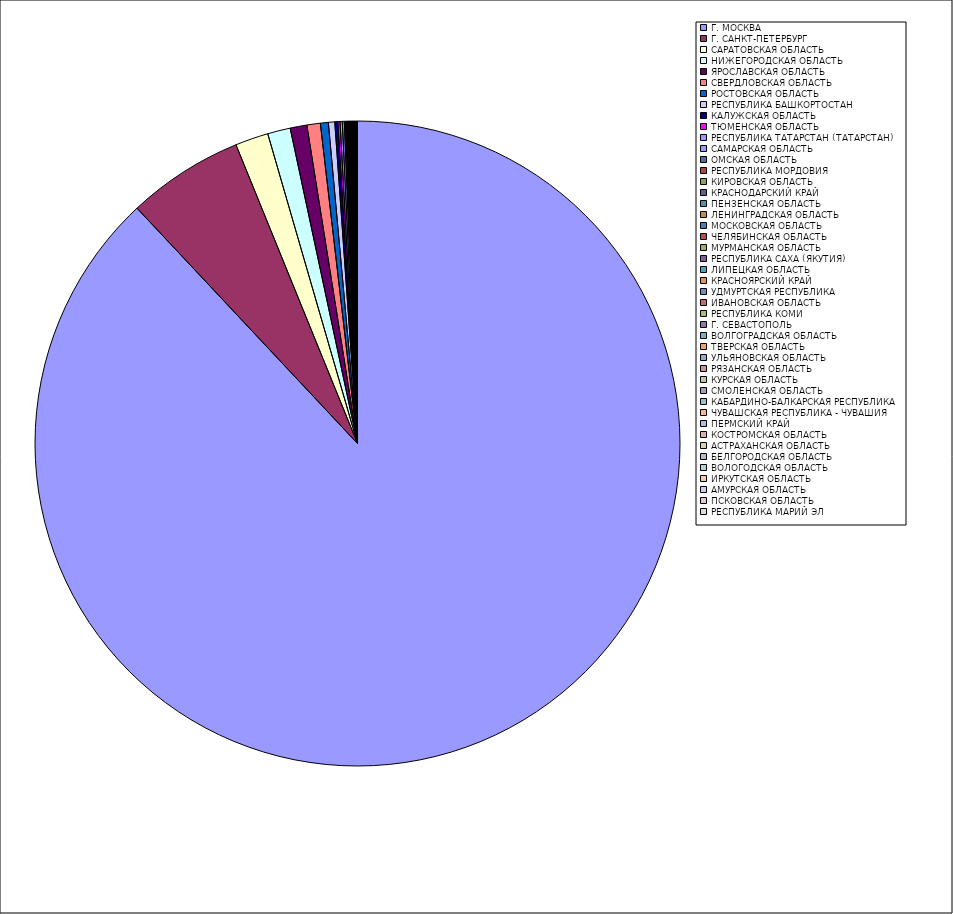
| Category | Оборот |
|---|---|
| Г. МОСКВА | 87.993 |
| Г. САНКТ-ПЕТЕРБУРГ | 5.833 |
| САРАТОВСКАЯ ОБЛАСТЬ | 1.66 |
| НИЖЕГОРОДСКАЯ ОБЛАСТЬ | 1.14 |
| ЯРОСЛАВСКАЯ ОБЛАСТЬ | 0.838 |
| СВЕРДЛОВСКАЯ ОБЛАСТЬ | 0.672 |
| РОСТОВСКАЯ ОБЛАСТЬ | 0.396 |
| РЕСПУБЛИКА БАШКОРТОСТАН | 0.32 |
| КАЛУЖСКАЯ ОБЛАСТЬ | 0.148 |
| ТЮМЕНСКАЯ ОБЛАСТЬ | 0.112 |
| РЕСПУБЛИКА ТАТАРСТАН (ТАТАРСТАН) | 0.111 |
| САМАРСКАЯ ОБЛАСТЬ | 0.098 |
| ОМСКАЯ ОБЛАСТЬ | 0.061 |
| РЕСПУБЛИКА МОРДОВИЯ | 0.044 |
| КИРОВСКАЯ ОБЛАСТЬ | 0.042 |
| КРАСНОДАРСКИЙ КРАЙ | 0.04 |
| ПЕНЗЕНСКАЯ ОБЛАСТЬ | 0.035 |
| ЛЕНИНГРАДСКАЯ ОБЛАСТЬ | 0.034 |
| МОСКОВСКАЯ ОБЛАСТЬ | 0.031 |
| ЧЕЛЯБИНСКАЯ ОБЛАСТЬ | 0.03 |
| МУРМАНСКАЯ ОБЛАСТЬ | 0.027 |
| РЕСПУБЛИКА САХА (ЯКУТИЯ) | 0.026 |
| ЛИПЕЦКАЯ ОБЛАСТЬ | 0.026 |
| КРАСНОЯРСКИЙ КРАЙ | 0.021 |
| УДМУРТСКАЯ РЕСПУБЛИКА | 0.018 |
| ИВАНОВСКАЯ ОБЛАСТЬ | 0.018 |
| РЕСПУБЛИКА КОМИ | 0.017 |
| Г. СЕВАСТОПОЛЬ | 0.016 |
| ВОЛГОГРАДСКАЯ ОБЛАСТЬ | 0.016 |
| ТВЕРСКАЯ ОБЛАСТЬ | 0.016 |
| УЛЬЯНОВСКАЯ ОБЛАСТЬ | 0.014 |
| РЯЗАНСКАЯ ОБЛАСТЬ | 0.013 |
| КУРСКАЯ ОБЛАСТЬ | 0.012 |
| СМОЛЕНСКАЯ ОБЛАСТЬ | 0.012 |
| КАБАРДИНО-БАЛКАРСКАЯ РЕСПУБЛИКА | 0.011 |
| ЧУВАШСКАЯ РЕСПУБЛИКА - ЧУВАШИЯ | 0.01 |
| ПЕРМСКИЙ КРАЙ | 0.009 |
| КОСТРОМСКАЯ ОБЛАСТЬ | 0.009 |
| АСТРАХАНСКАЯ ОБЛАСТЬ | 0.008 |
| БЕЛГОРОДСКАЯ ОБЛАСТЬ | 0.008 |
| ВОЛОГОДСКАЯ ОБЛАСТЬ | 0.007 |
| ИРКУТСКАЯ ОБЛАСТЬ | 0.007 |
| АМУРСКАЯ ОБЛАСТЬ | 0.007 |
| ПСКОВСКАЯ ОБЛАСТЬ | 0.005 |
| РЕСПУБЛИКА МАРИЙ ЭЛ | 0.005 |